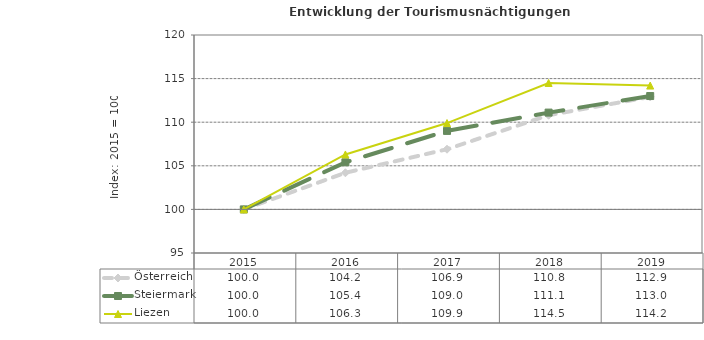
| Category | Österreich | Steiermark | Liezen |
|---|---|---|---|
| 2019.0 | 112.9 | 113 | 114.2 |
| 2018.0 | 110.8 | 111.1 | 114.5 |
| 2017.0 | 106.9 | 109 | 109.9 |
| 2016.0 | 104.2 | 105.4 | 106.3 |
| 2015.0 | 100 | 100 | 100 |